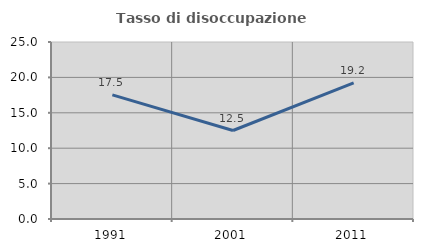
| Category | Tasso di disoccupazione giovanile  |
|---|---|
| 1991.0 | 17.526 |
| 2001.0 | 12.5 |
| 2011.0 | 19.231 |